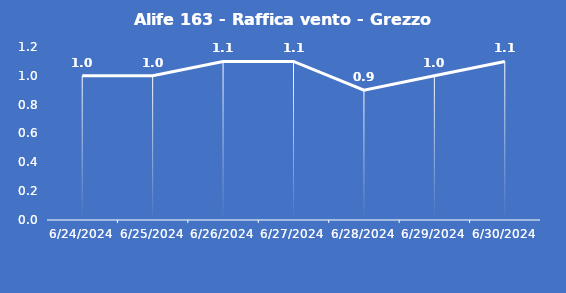
| Category | Alife 163 - Raffica vento - Grezzo (m/s) |
|---|---|
| 6/24/24 | 1 |
| 6/25/24 | 1 |
| 6/26/24 | 1.1 |
| 6/27/24 | 1.1 |
| 6/28/24 | 0.9 |
| 6/29/24 | 1 |
| 6/30/24 | 1.1 |